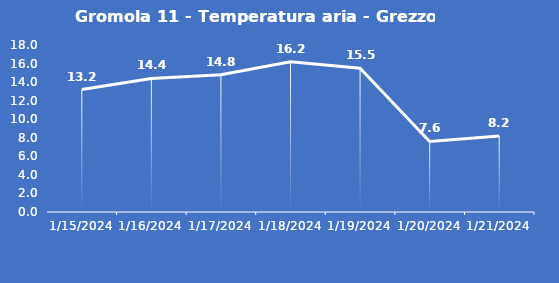
| Category | Gromola 11 - Temperatura aria - Grezzo (°C) |
|---|---|
| 1/15/24 | 13.2 |
| 1/16/24 | 14.4 |
| 1/17/24 | 14.8 |
| 1/18/24 | 16.2 |
| 1/19/24 | 15.5 |
| 1/20/24 | 7.6 |
| 1/21/24 | 8.2 |